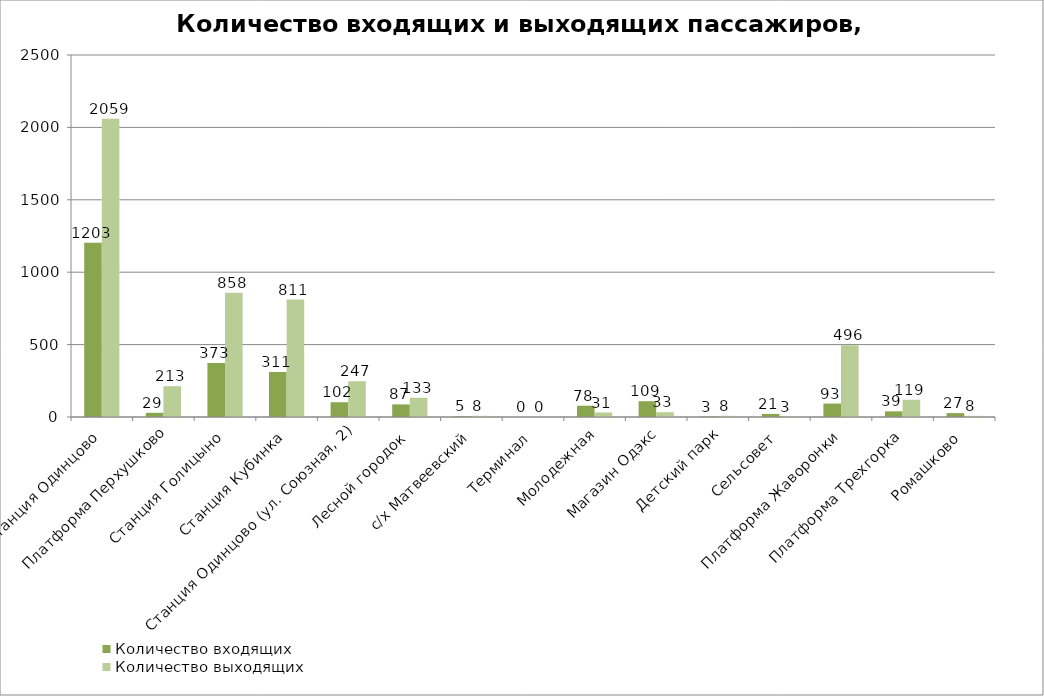
| Category | Количество входящих | Количество выходящих |
|---|---|---|
| Станция Одинцово | 1203 | 2059 |
| Платформа Перхушково | 29 | 213 |
| Станция Голицыно | 373 | 858 |
| Станция Кубинка | 311 | 811 |
| Станция Одинцово (ул. Союзная, 2) | 102 | 247 |
| Лесной городок | 87 | 133 |
| с/х Матвеевский | 5 | 8 |
| Терминал | 0 | 0 |
| Молодежная | 78 | 31 |
| Магазин Одэкс | 109 | 33 |
| Детский парк | 3 | 8 |
| Сельсовет | 21 | 3 |
| Платформа Жаворонки | 93 | 496 |
| Платформа Трехгорка | 39 | 119 |
| Ромашково | 27 | 8 |